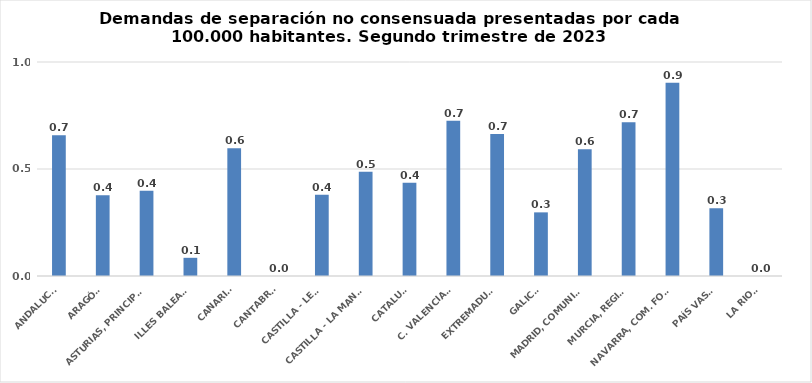
| Category | Series 0 |
|---|---|
| ANDALUCÍA | 0.658 |
| ARAGÓN | 0.377 |
| ASTURIAS, PRINCIPADO | 0.398 |
| ILLES BALEARS | 0.085 |
| CANARIAS | 0.597 |
| CANTABRIA | 0 |
| CASTILLA - LEÓN | 0.379 |
| CASTILLA - LA MANCHA | 0.487 |
| CATALUÑA | 0.436 |
| C. VALENCIANA | 0.726 |
| EXTREMADURA | 0.664 |
| GALICIA | 0.297 |
| MADRID, COMUNIDAD | 0.593 |
| MURCIA, REGIÓN | 0.718 |
| NAVARRA, COM. FORAL | 0.903 |
| PAÍS VASCO | 0.317 |
| LA RIOJA | 0 |